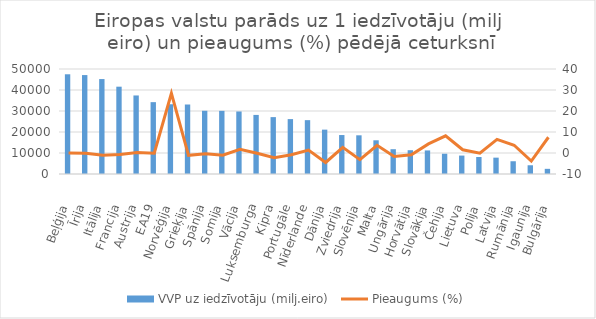
| Category | VVP uz iedzīvotāju (milj.eiro) |
|---|---|
|  Beļģija | 47487.154 |
| Īrija | 47110.555 |
| Itālija | 45207.319 |
| Francija | 41578.85 |
|  Austrija | 37400.243 |
| EA19 | 34213.876 |
| Norvēģija | 33213.419 |
| Grieķija | 33093.097 |
| Spānija | 30111.272 |
| Somija | 30071.779 |
| Vācija | 29773.015 |
| Luksemburga | 28131.331 |
| Kipra | 27087.958 |
| Portugāle | 26143.446 |
| Nīderlande | 25642.309 |
| Dānija | 21121.498 |
| Zviedrija | 18552.956 |
| Slovēnija | 18424.952 |
| Malta | 16051.928 |
| Ungārija | 11806.319 |
| Horvātija | 11326.903 |
| Slovākija | 11220.12 |
|  Čehija | 9647.921 |
| Lietuva | 8776.219 |
| Polija | 8108.771 |
| Latvija | 7785.507 |
| Rumānija | 6073.328 |
| Igaunija | 4161.366 |
|  Bulgārija | 2459.941 |